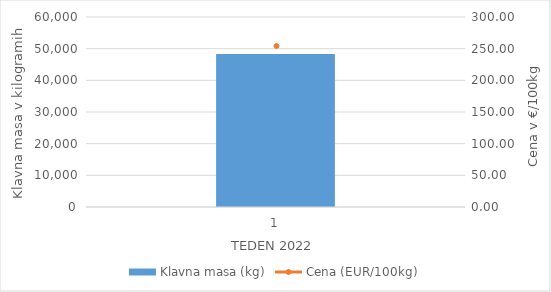
| Category | Klavna masa (kg) |
|---|---|
| 1.0 | 48349 |